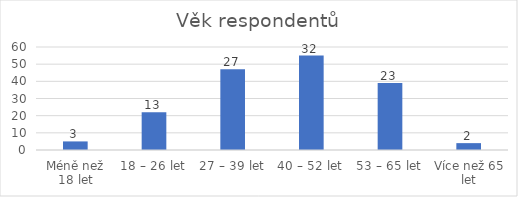
| Category | Počet respondentů |
|---|---|
| Méně než 18 let | 5 |
| 18 – 26 let | 22 |
| 27 – 39 let | 47 |
| 40 – 52 let | 55 |
| 53 – 65 let | 39 |
| Více než 65 let | 4 |